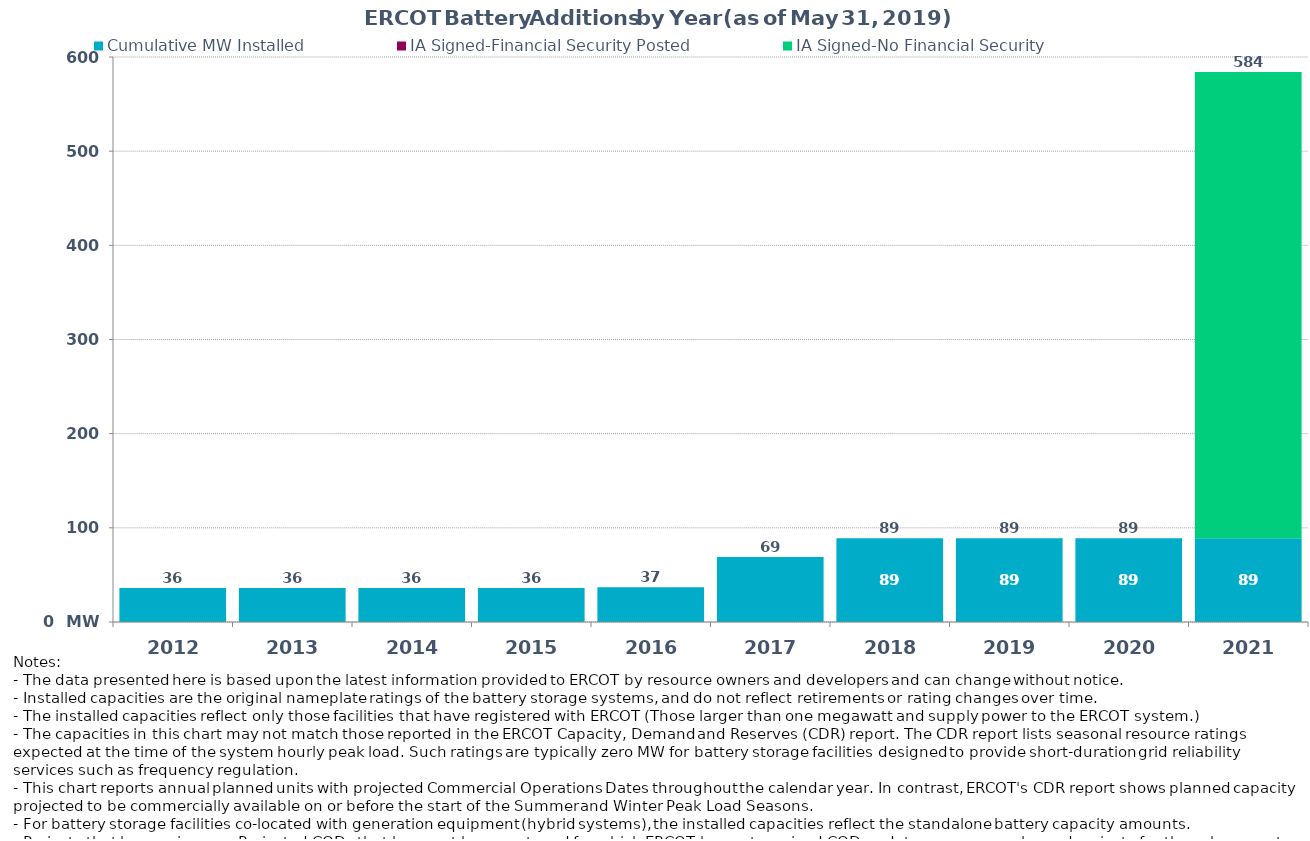
| Category | Cumulative MW Installed | IA Signed-Financial Security Posted  | IA Signed-No Financial Security  | Cumulative Installed and Planned |
|---|---|---|---|---|
| 2012.0 | 36 | 0 | 0 | 36 |
| 2013.0 | 36 | 0 | 0 | 36 |
| 2014.0 | 36 | 0 | 0 | 36 |
| 2015.0 | 36 | 0 | 0 | 36 |
| 2016.0 | 37 | 0 | 0 | 37 |
| 2017.0 | 69 | 0 | 0 | 69 |
| 2018.0 | 89 | 0 | 0 | 89 |
| 2019.0 | 89 | 0 | 0 | 89 |
| 2020.0 | 89 | 0 | 0 | 89 |
| 2021.0 | 89 | 0 | 495 | 584 |